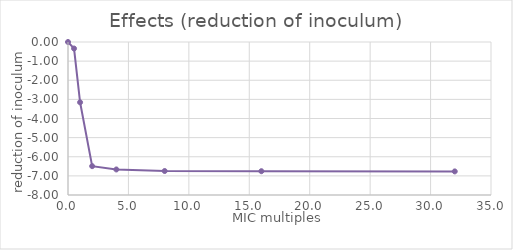
| Category | Series 3 |
|---|---|
| 0.0 | 0 |
| 0.5 | -0.341 |
| 1.0 | -3.153 |
| 2.0 | -6.491 |
| 4.0 | -6.665 |
| 8.0 | -6.747 |
| 16.0 | -6.756 |
| 32.0 | -6.767 |